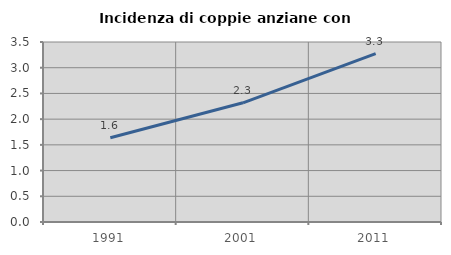
| Category | Incidenza di coppie anziane con figli |
|---|---|
| 1991.0 | 1.638 |
| 2001.0 | 2.317 |
| 2011.0 | 3.276 |